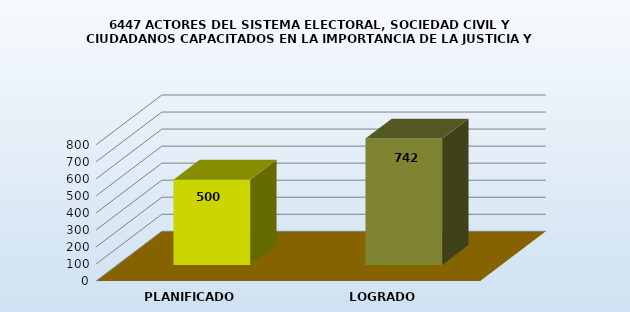
| Category | 6447 |
|---|---|
| PLANIFICADO | 500 |
| LOGRADO | 742 |